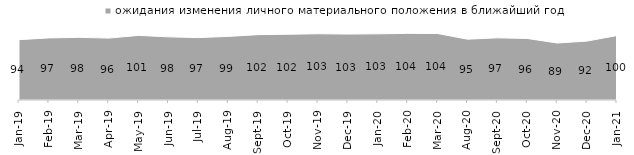
| Category | ожидания изменения личного материального положения в ближайший год |
|---|---|
| 2019-01-01 | 94.05 |
| 2019-02-01 | 96.75 |
| 2019-03-01 | 97.663 |
| 2019-04-01 | 96.436 |
| 2019-05-01 | 100.693 |
| 2019-06-01 | 98.404 |
| 2019-07-01 | 97.228 |
| 2019-08-01 | 99.151 |
| 2019-09-01 | 101.881 |
| 2019-10-01 | 102.475 |
| 2019-11-01 | 103.218 |
| 2019-12-01 | 102.772 |
| 2020-01-01 | 103.119 |
| 2020-02-01 | 103.861 |
| 2020-03-01 | 103.619 |
| 2020-08-01 | 94.786 |
| 2020-09-01 | 96.864 |
| 2020-10-01 | 95.914 |
| 2020-11-01 | 88.8 |
| 2020-12-01 | 91.82 |
| 2021-01-01 | 100.447 |